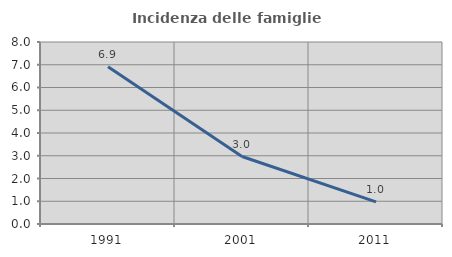
| Category | Incidenza delle famiglie numerose |
|---|---|
| 1991.0 | 6.913 |
| 2001.0 | 2.966 |
| 2011.0 | 0.973 |